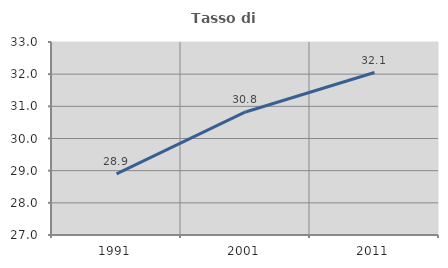
| Category | Tasso di occupazione   |
|---|---|
| 1991.0 | 28.898 |
| 2001.0 | 30.825 |
| 2011.0 | 32.051 |